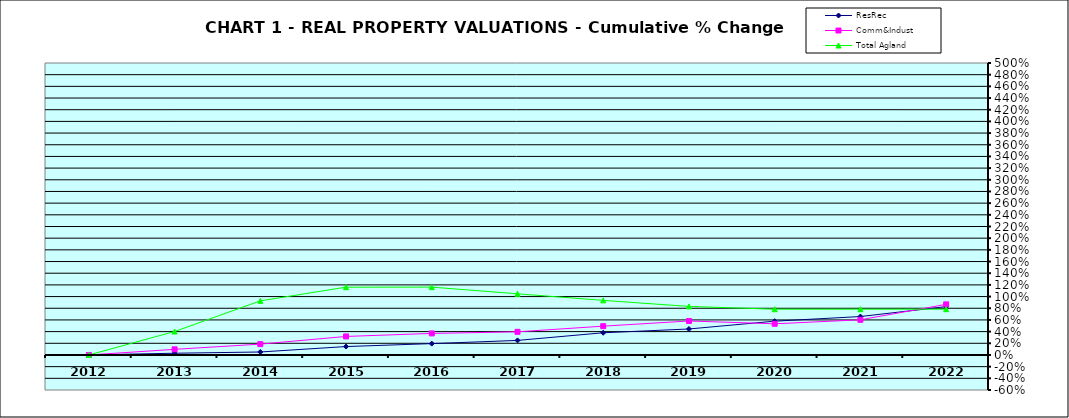
| Category | ResRec | Comm&Indust | Total Agland |
|---|---|---|---|
| 2012.0 | 0 | 0 | 0 |
| 2013.0 | 0.03 | 0.096 | 0.402 |
| 2014.0 | 0.051 | 0.186 | 0.927 |
| 2015.0 | 0.144 | 0.317 | 1.161 |
| 2016.0 | 0.194 | 0.369 | 1.162 |
| 2017.0 | 0.249 | 0.396 | 1.047 |
| 2018.0 | 0.38 | 0.493 | 0.935 |
| 2019.0 | 0.445 | 0.582 | 0.832 |
| 2020.0 | 0.579 | 0.534 | 0.783 |
| 2021.0 | 0.658 | 0.602 | 0.784 |
| 2022.0 | 0.828 | 0.867 | 0.784 |